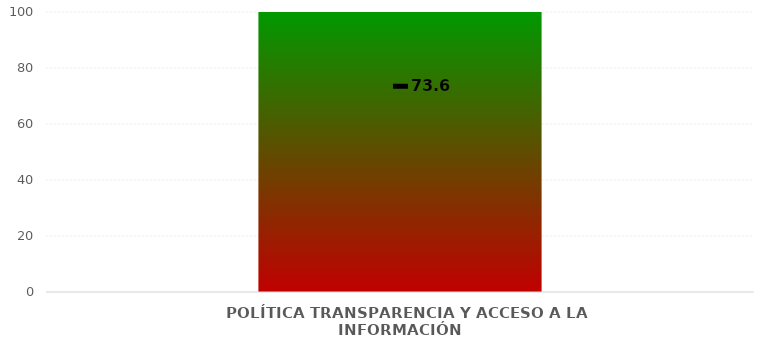
| Category | Niveles |
|---|---|
| POLÍTICA TRANSPARENCIA Y ACCESO A LA INFORMACIÓN  | 100 |